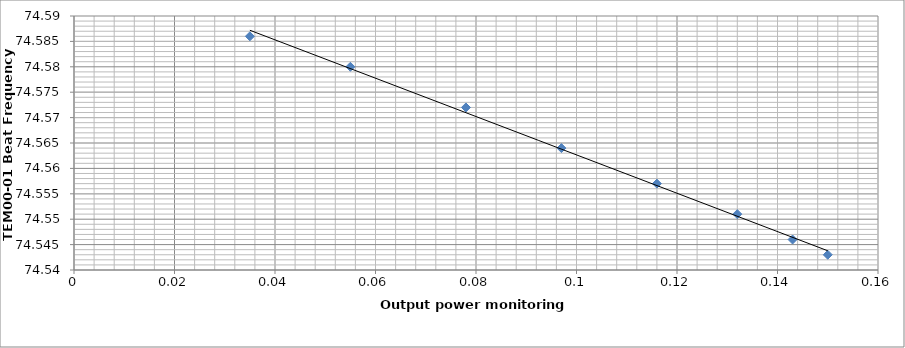
| Category | Series 0 |
|---|---|
| 0.15 | 74.543 |
| 0.143 | 74.546 |
| 0.132 | 74.551 |
| 0.116 | 74.557 |
| 0.097 | 74.564 |
| 0.078 | 74.572 |
| 0.055 | 74.58 |
| 0.035 | 74.586 |